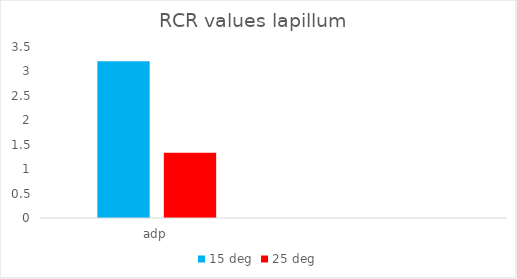
| Category | 15 deg | 25 deg |
|---|---|---|
| adp | 3.21 | 1.337 |